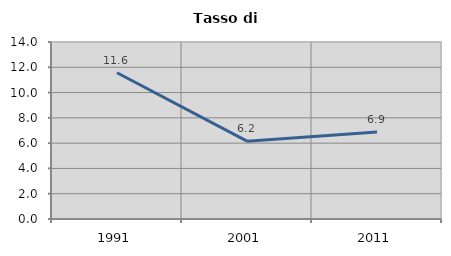
| Category | Tasso di disoccupazione   |
|---|---|
| 1991.0 | 11.569 |
| 2001.0 | 6.156 |
| 2011.0 | 6.88 |